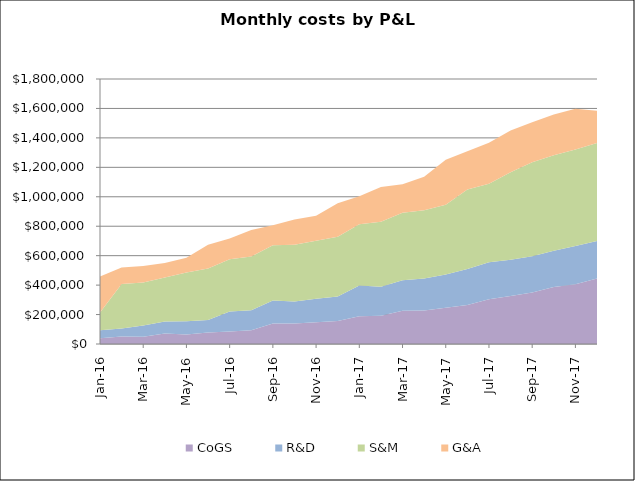
| Category | CoGS | R&D | S&M | G&A |
|---|---|---|---|---|
| Jan-16 | 38891.75 | 54900 | 120250 | 244677.5 |
| Feb-16 | 50981.759 | 54900 | 302400 | 110783.388 |
| Mar-16 | 48695.612 | 77600 | 291650 | 111932.713 |
| Apr-16 | 70810.263 | 82750 | 297650 | 98141.331 |
| May-16 | 64727.179 | 90100 | 330900 | 99410.106 |
| Jun-16 | 77552.201 | 86100 | 349350 | 160992.471 |
| Jul-16 | 85547.478 | 134550 | 355350 | 140316.163 |
| Aug-16 | 93706.417 | 135700 | 365350 | 179036.128 |
| Sep-16 | 139146.017 | 156200 | 375350 | 136082.951 |
| Oct-16 | 139922.599 | 148200 | 385350 | 172660.353 |
| Nov-16 | 147147.058 | 159550 | 395350 | 168924.74 |
| Dec-16 | 156568.852 | 166900 | 405350 | 227466.972 |
| Jan-17 | 188984.053 | 208950 | 415350 | 189722.972 |
| Feb-17 | 192514.966 | 196950 | 440200 | 237372.039 |
| Mar-17 | 225045.783 | 208300 | 457450 | 195132.814 |
| Apr-17 | 227096.674 | 217450 | 463450 | 228023.044 |
| May-17 | 246906.956 | 224800 | 473450 | 305686.445 |
| Jun-17 | 265255.466 | 244100 | 539450 | 260129.686 |
| Jul-17 | 304653.05 | 250450 | 533450 | 278713.559 |
| Aug-17 | 325644.467 | 246450 | 595200 | 282720.275 |
| Sep-17 | 349762.055 | 246450 | 637950 | 271918.856 |
| Oct-17 | 386474.601 | 246450 | 649600 | 276320.353 |
| Nov-17 | 405711.989 | 259600 | 655600 | 277202.641 |
| Dec-17 | 444770.42 | 255600 | 665600 | 218538.482 |